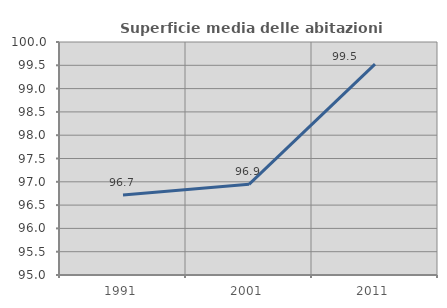
| Category | Superficie media delle abitazioni occupate |
|---|---|
| 1991.0 | 96.716 |
| 2001.0 | 96.946 |
| 2011.0 | 99.524 |